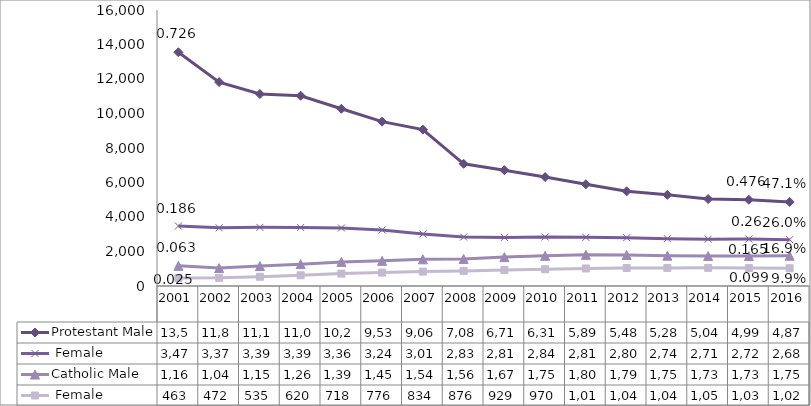
| Category | Protestant | Catholic |
|---|---|---|
| 2001.0 | 3475 | 463 |
| 2002.0 | 3372 | 472 |
| 2003.0 | 3399 | 535 |
| 2004.0 | 3392 | 620 |
| 2005.0 | 3363 | 718 |
| 2006.0 | 3246 | 776 |
| 2007.0 | 3015 | 834 |
| 2008.0 | 2838 | 876 |
| 2009.0 | 2815 | 929 |
| 2010.0 | 2844 | 970 |
| 2011.0 | 2819 | 1016 |
| 2012.0 | 2800 | 1046 |
| 2013.0 | 2743 | 1048 |
| 2014.0 | 2717 | 1052 |
| 2015.0 | 2723 | 1037 |
| 2016.0 | 2688 | 1029 |